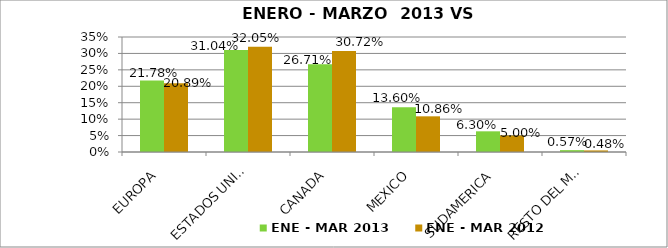
| Category | ENE - MAR 2013 | ENE - MAR 2012 |
|---|---|---|
| EUROPA | 0.218 | 0.209 |
| ESTADOS UNIDOS | 0.31 | 0.32 |
| CANADA | 0.267 | 0.307 |
| MEXICO | 0.136 | 0.109 |
| SUDAMERICA | 0.063 | 0.05 |
| RESTO DEL MUNDO | 0.006 | 0.005 |